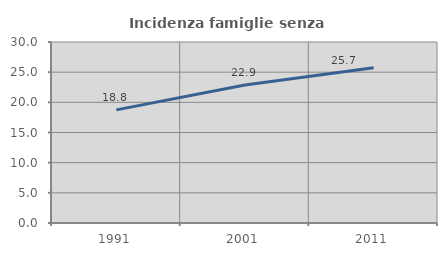
| Category | Incidenza famiglie senza nuclei |
|---|---|
| 1991.0 | 18.75 |
| 2001.0 | 22.878 |
| 2011.0 | 25.731 |